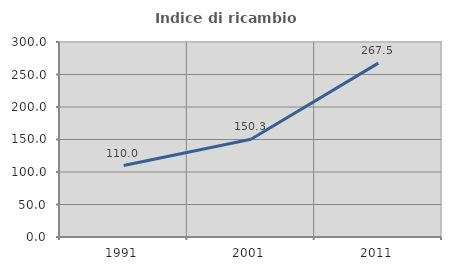
| Category | Indice di ricambio occupazionale  |
|---|---|
| 1991.0 | 110 |
| 2001.0 | 150.344 |
| 2011.0 | 267.486 |